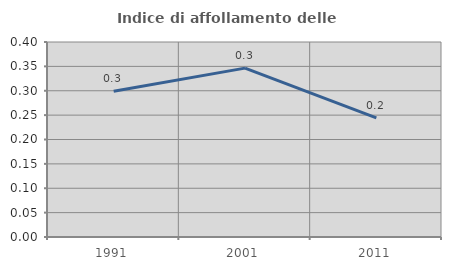
| Category | Indice di affollamento delle abitazioni  |
|---|---|
| 1991.0 | 0.299 |
| 2001.0 | 0.346 |
| 2011.0 | 0.244 |